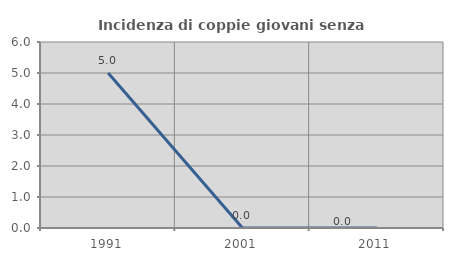
| Category | Incidenza di coppie giovani senza figli |
|---|---|
| 1991.0 | 5 |
| 2001.0 | 0 |
| 2011.0 | 0 |